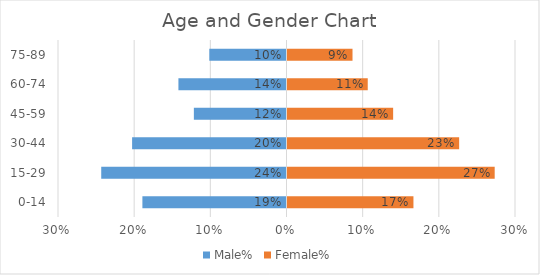
| Category | Male% | Female% |
|---|---|---|
| 0-14 | -0.189 | 0.167 |
| 15-29 | -0.243 | 0.273 |
| 30-44 | -0.203 | 0.227 |
| 45-59 | -0.122 | 0.14 |
| 60-74 | -0.142 | 0.107 |
| 75-89 | -0.101 | 0.087 |